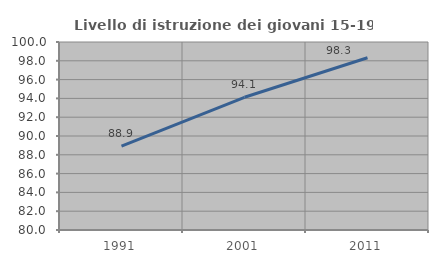
| Category | Livello di istruzione dei giovani 15-19 anni |
|---|---|
| 1991.0 | 88.93 |
| 2001.0 | 94.118 |
| 2011.0 | 98.319 |